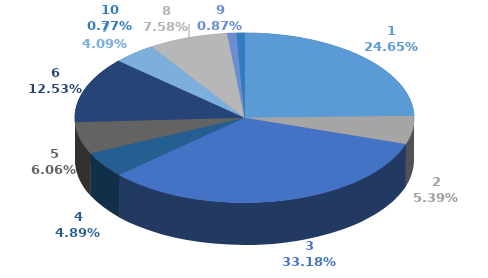
| Category | Series 0 |
|---|---|
| 0 | 322181 |
| 1 | 70446 |
| 2 | 433663 |
| 3 | 63872 |
| 4 | 79212 |
| 5 | 163785 |
| 6 | 53418 |
| 7 | 99143 |
| 8 | 11400 |
| 9 | 10000 |